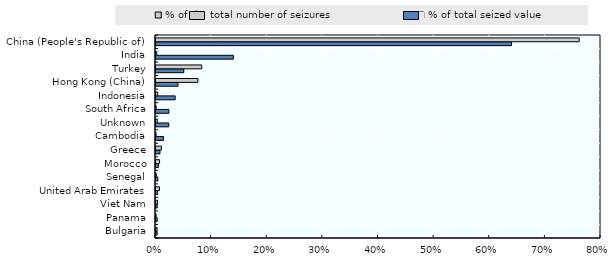
| Category | % of total seized value | % of the total number of seizures |
|---|---|---|
| Bulgaria | 0.002 | 0.002 |
| Panama | 0.002 | 0 |
| Viet Nam | 0.002 | 0.003 |
| United Arab Emirates | 0.003 | 0.006 |
| Senegal | 0.003 | 0.001 |
| Morocco | 0.004 | 0.006 |
| Greece | 0.007 | 0.01 |
| Cambodia | 0.013 | 0 |
| Unknown | 0.023 | 0.002 |
| South Africa | 0.023 | 0 |
| Indonesia | 0.034 | 0.003 |
| Hong Kong (China) | 0.039 | 0.075 |
| Turkey | 0.05 | 0.082 |
| India | 0.139 | 0.001 |
| China (People's Republic of) | 0.639 | 0.761 |